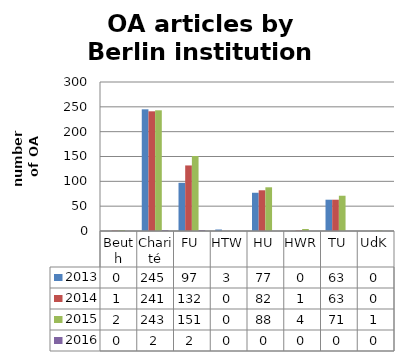
| Category | 2013 | 2014 | 2015 | 2016 |
|---|---|---|---|---|
| Beuth | 0 | 1 | 2 | 0 |
| Charité | 245 | 241 | 243 | 2 |
| FU | 97 | 132 | 151 | 2 |
| HTW | 3 | 0 | 0 | 0 |
| HU | 77 | 82 | 88 | 0 |
| HWR | 0 | 1 | 4 | 0 |
| TU | 63 | 63 | 71 | 0 |
| UdK | 0 | 0 | 1 | 0 |